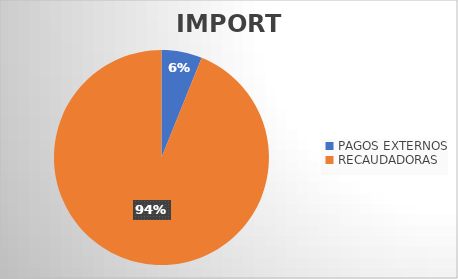
| Category | IMPORTE |
|---|---|
| PAGOS EXTERNOS | 18465625.1 |
| RECAUDADORAS | 284454314.41 |